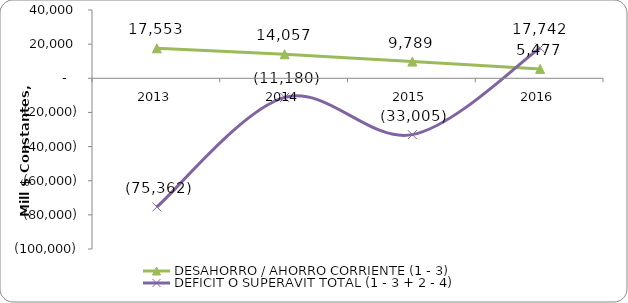
| Category | DESAHORRO / AHORRO CORRIENTE (1 - 3) | DEFICIT O SUPERAVIT TOTAL (1 - 3 + 2 - 4) |
|---|---|---|
| 2013.0 | 17553.188 | -75361.588 |
| 2014.0 | 14057.462 | -11180.085 |
| 2015.0 | 9789.101 | -33004.758 |
| 2016.0 | 5477.438 | 17742.285 |